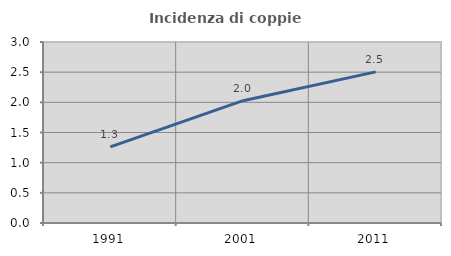
| Category | Incidenza di coppie miste |
|---|---|
| 1991.0 | 1.261 |
| 2001.0 | 2.027 |
| 2011.0 | 2.505 |